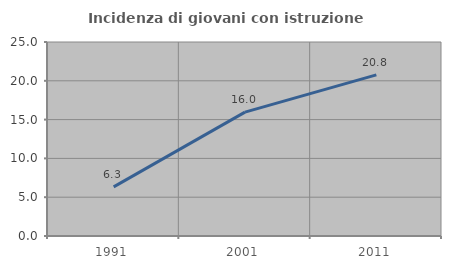
| Category | Incidenza di giovani con istruzione universitaria |
|---|---|
| 1991.0 | 6.335 |
| 2001.0 | 15.97 |
| 2011.0 | 20.765 |